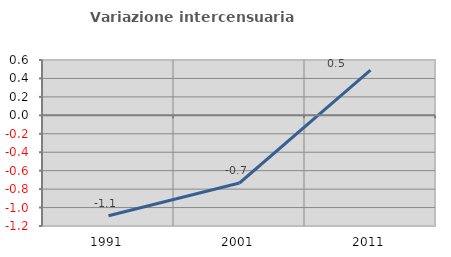
| Category | Variazione intercensuaria annua |
|---|---|
| 1991.0 | -1.088 |
| 2001.0 | -0.734 |
| 2011.0 | 0.491 |